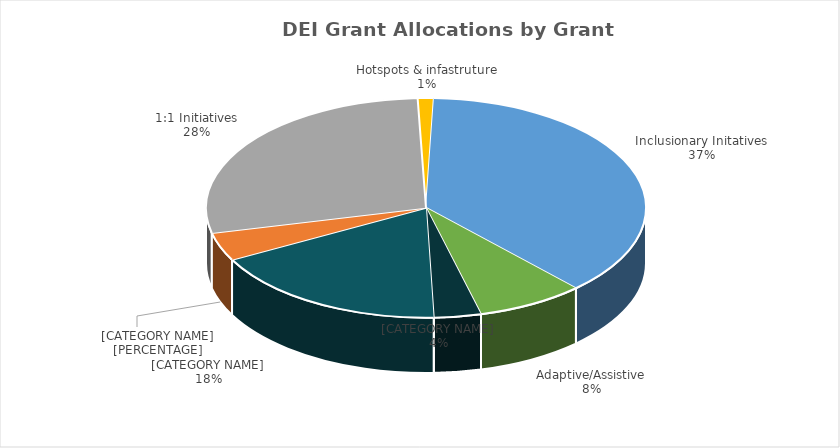
| Category | Series 0 |
|---|---|
| Technology Support/Coaching Staff | 3074442 |
| PD & Professional Certs | 717826 |
| 1:1 Initiatives | 4868513 |
| Hotspots & infastruture | 204011 |
| Inclusionary Initatives | 6502027 |
| Adaptive/Assistive | 1372512 |
| Purchased Services | 599921 |